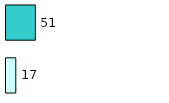
| Category | Series 0 | Series 1 |
|---|---|---|
| 0 | 17 | 51 |